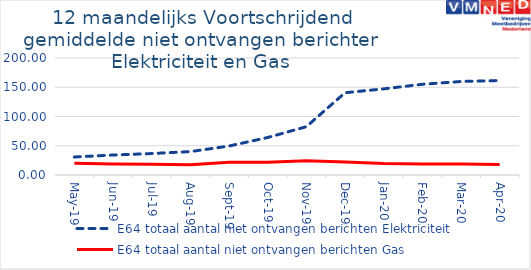
| Category | E64 totaal aantal niet ontvangen berichten Elektriciteit | E64 totaal aantal niet ontvangen berichten Gas |
|---|---|---|
| 2019-05-01 | 30.75 | 20.25 |
| 2019-06-01 | 34.167 | 18.917 |
| 2019-07-01 | 36.667 | 18.5 |
| 2019-08-01 | 40 | 17.583 |
| 2019-09-01 | 49.5 | 21.667 |
| 2019-10-01 | 64.083 | 21.917 |
| 2019-11-01 | 82.583 | 24.333 |
| 2019-12-01 | 140.583 | 22.333 |
| 2020-01-01 | 147.25 | 19.5 |
| 2020-02-01 | 155.083 | 18.667 |
| 2020-03-01 | 159.833 | 18.667 |
| 2020-04-01 | 161.5 | 17.75 |